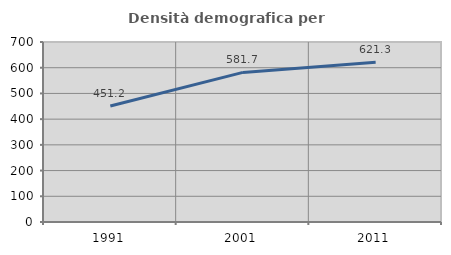
| Category | Densità demografica |
|---|---|
| 1991.0 | 451.212 |
| 2001.0 | 581.736 |
| 2011.0 | 621.334 |